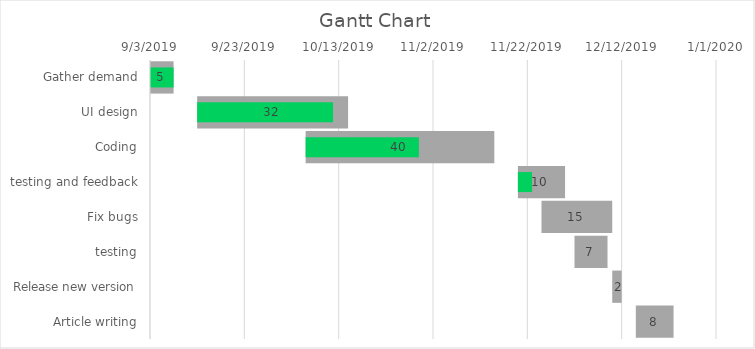
| Category | Series 0 | Duration |
|---|---|---|
| Gather demand | 9/3/19 | 5 |
| UI design | 9/13/19 | 32 |
| Coding | 10/6/19 | 40 |
| testing and feedback | 11/20/19 | 10 |
| Fix bugs | 11/25/19 | 15 |
| testing | 12/2/19 | 7 |
| Release new version | 12/10/19 | 2 |
| Article writing | 12/15/19 | 8 |